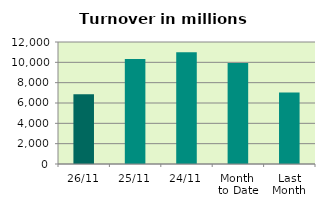
| Category | Series 0 |
|---|---|
| 26/11 | 6857.514 |
| 25/11 | 10328.393 |
| 24/11 | 10994.997 |
| Month 
to Date | 9929.649 |
| Last
Month | 7023.861 |